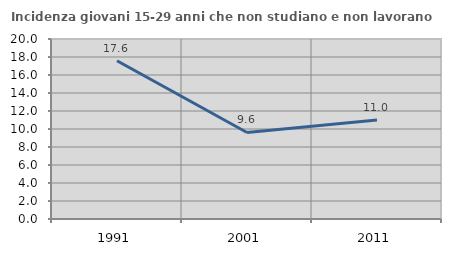
| Category | Incidenza giovani 15-29 anni che non studiano e non lavorano  |
|---|---|
| 1991.0 | 17.583 |
| 2001.0 | 9.615 |
| 2011.0 | 10.987 |